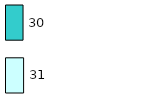
| Category | Series 0 | Series 1 |
|---|---|---|
| 0 | 31 | 30 |